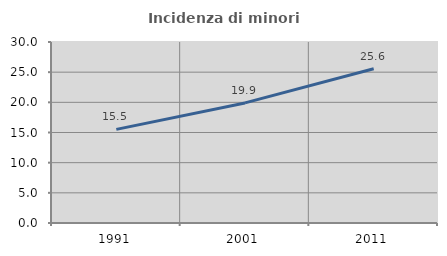
| Category | Incidenza di minori stranieri |
|---|---|
| 1991.0 | 15.517 |
| 2001.0 | 19.903 |
| 2011.0 | 25.559 |